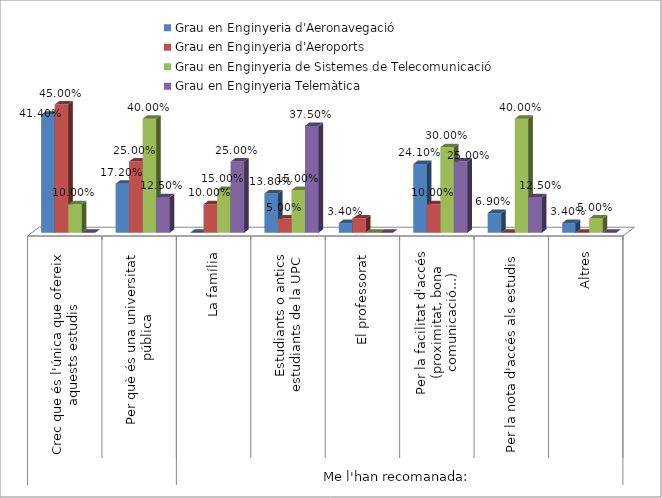
| Category | Grau en Enginyeria d'Aeronavegació | Grau en Enginyeria d'Aeroports | Grau en Enginyeria de Sistemes de Telecomunicació | Grau en Enginyeria Telemàtica |
|---|---|---|---|---|
| 0 | 0.414 | 0.45 | 0.1 | 0 |
| 1 | 0.172 | 0.25 | 0.4 | 0.125 |
| 2 | 0 | 0.1 | 0.15 | 0.25 |
| 3 | 0.138 | 0.05 | 0.15 | 0.375 |
| 4 | 0.034 | 0.05 | 0 | 0 |
| 5 | 0.241 | 0.1 | 0.3 | 0.25 |
| 6 | 0.069 | 0 | 0.4 | 0.125 |
| 7 | 0.034 | 0 | 0.05 | 0 |